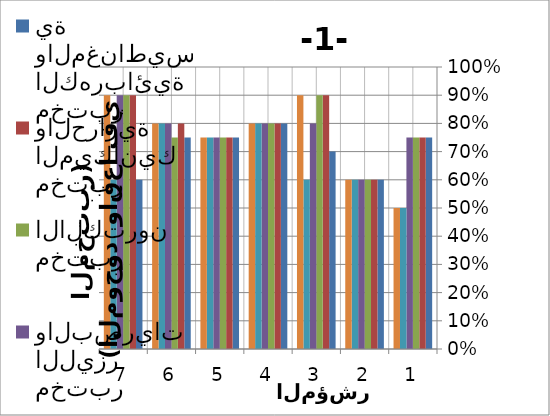
| Category | مختبر الكهربائية والمغناطيسية | مختبر الميكانيك والحرارية | مختبر الالكترون | مختبر الليزر والبصريات | مختبر الذرية والنووية | مختبر الصلبة |
|---|---|---|---|---|---|---|
| 0 | 0.75 | 0.75 | 0.75 | 0.75 | 0.5 | 0.5 |
| 1 | 0.6 | 0.6 | 0.6 | 0.6 | 0.6 | 0.6 |
| 2 | 0.7 | 0.9 | 0.9 | 0.8 | 0.6 | 0.9 |
| 3 | 0.8 | 0.8 | 0.8 | 0.8 | 0.8 | 0.8 |
| 4 | 0.75 | 0.75 | 0.75 | 0.75 | 0.75 | 0.75 |
| 5 | 0.75 | 0.8 | 0.75 | 0.8 | 0.8 | 0.8 |
| 6 | 0.6 | 0.9 | 0.9 | 0.9 | 0.6 | 0.9 |